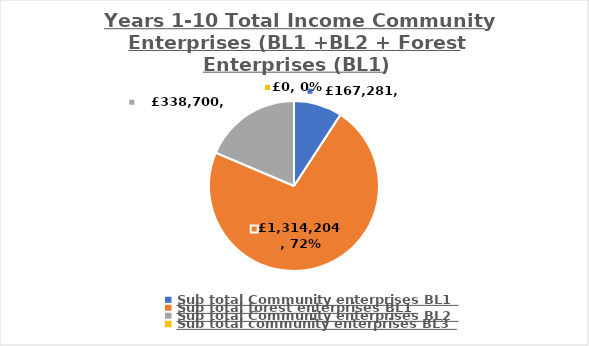
| Category | Series 0 |
|---|---|
| Sub total Community enterprises BL1 | 167280.8 |
| Sub total forest enterprises BL1 | 1314204 |
| Sub total Community enterprises BL2 | 338700 |
| Sub total community enterprises BL3 | 0 |